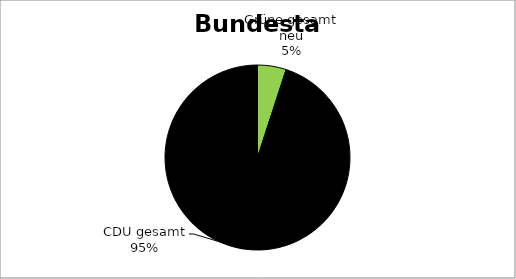
| Category | Series 0 |
|---|---|
| Grüne gesamt neu | 30 |
| CDU gesamt | 568 |